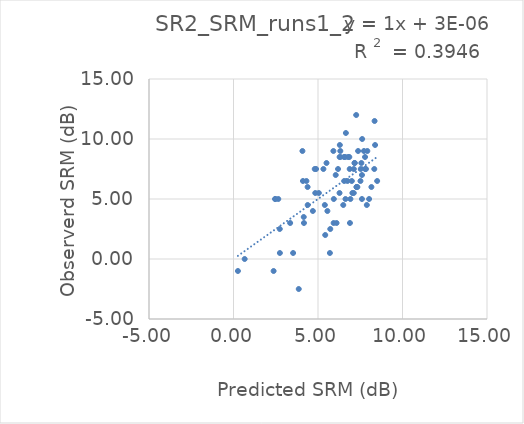
| Category | SR2_SRM_runs1_2 |
|---|---|
| 3.86096 | -2.5 |
| 5.70401 | 0.5 |
| 6.890659999999999 | 3 |
| 5.42803 | 2 |
| 7.88917 | 4.5 |
| 2.3735 | -1 |
| 5.72675 | 2.5 |
| 6.09785 | 3 |
| 3.52709 | 0.5 |
| 8.0246 | 5 |
| 5.92521 | 3 |
| 7.60079 | 5 |
| 2.74459 | 0.5 |
| 8.16001 | 6 |
| 8.50112 | 6.5 |
| 6.49474 | 4.5 |
| 6.91855 | 5 |
| 6.62709 | 5 |
| 7.11602 | 5.5 |
| 5.5562 | 4 |
| 7.03333 | 5.5 |
| 7.32996 | 6 |
| 7.28965 | 6 |
| 7.27724 | 6 |
| 0.2617 | -1 |
| 4.169 | 3 |
| 7.51293 | 6.5 |
| 5.93552 | 5 |
| 5.4032 | 4.5 |
| 8.33056 | 7.5 |
| 6.27356 | 5.5 |
| 4.69616 | 4 |
| 0.66068 | 0 |
| 4.1566 | 3.5 |
| 7.60079 | 7 |
| 7.00126 | 6.5 |
| 3.35235 | 3 |
| 7.83646 | 7.5 |
| 7.788909999999999 | 7.5 |
| 6.74492 | 6.5 |
| 2.73734 | 2.5 |
| 6.54954 | 6.5 |
| 7.5305 | 7.5 |
| 4.3902 | 4.5 |
| 7.1191 | 7.5 |
| 7.56565 | 8 |
| 5.04968 | 5.5 |
| 6.87518 | 7.5 |
| 4.83882 | 5.5 |
| 7.78374 | 8.5 |
| 7.17698 | 8 |
| 7.15941 | 8 |
| 6.04821 | 7 |
| 7.91917 | 9 |
| 8.37812 | 9.5 |
| 7.72071 | 9 |
| 6.1857 | 7.5 |
| 4.38503 | 6 |
| 7.37236 | 9 |
| 6.85343 | 8.5 |
| 6.78523 | 8.5 |
| 6.61259 | 8.5 |
| 6.53923 | 8.5 |
| 6.32628 | 8.5 |
| 5.32051 | 7.5 |
| 4.31474 | 6.5 |
| 6.27873 | 8.5 |
| 2.64948 | 5 |
| 7.61319 | 10 |
| 4.10905 | 6.5 |
| 5.50348 | 8 |
| 2.47376 | 5 |
| 2.46136 | 5 |
| 4.88638 | 7.5 |
| 6.32111 | 9 |
| 4.80675 | 7.5 |
| 5.90972 | 9 |
| 8.34813 | 11.5 |
| 6.29113 | 9.5 |
| 6.64983 | 10.5 |
| 7.25967 | 12 |
| 4.07906 | 9 |